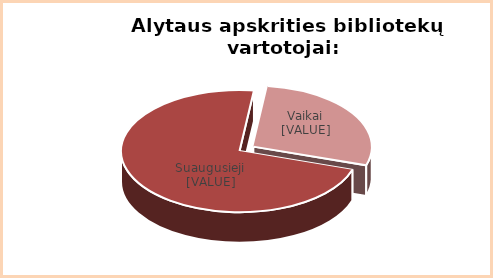
| Category | Series 0 |
|---|---|
| Vaikai | 0.28 |
| Suaugusieji | 0.72 |